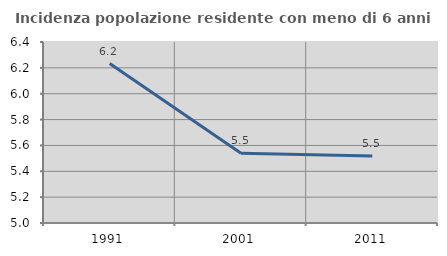
| Category | Incidenza popolazione residente con meno di 6 anni |
|---|---|
| 1991.0 | 6.233 |
| 2001.0 | 5.54 |
| 2011.0 | 5.518 |